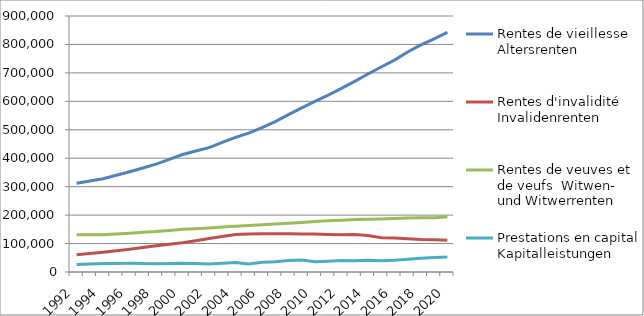
| Category | Rentes de vieillesse | Rentes d'invalidité | Rentes de veuves et de veufs | Prestations en capital |
|---|---|---|---|---|
| 1992.0 | 312325 | 60597 | 130710 | 26457 |
| 1993.0 | 320058.5 | 65179 | 130871 | 28070.5 |
| 1994.0 | 327792 | 69761 | 131032 | 29684 |
| 1995.0 | 340185.5 | 74892 | 133756 | 30013 |
| 1996.0 | 352579 | 80023 | 136480 | 30342 |
| 1997.0 | 365830 | 86134.5 | 139322 | 29743.5 |
| 1998.0 | 379081 | 92246 | 142164 | 29145 |
| 1999.0 | 396080.5 | 97375 | 146104 | 30154.5 |
| 2000.0 | 413080 | 102504 | 150044 | 31164 |
| 2001.0 | 425192 | 110169.5 | 152324 | 29736 |
| 2002.0 | 437304 | 117835 | 154604 | 28308 |
| 2003.0 | 455437 | 124769.5 | 157800.5 | 30957 |
| 2004.0 | 473570 | 131704 | 160997 | 33606 |
| 2005.0 | 488218 | 133371 | 163634 | 28143 |
| 2006.0 | 507256 | 134804 | 166104 | 33892 |
| 2007.0 | 528866 | 134620 | 168510 | 36394 |
| 2008.0 | 553378 | 134217 | 171383 | 40285 |
| 2009.0 | 577165 | 133895 | 174016 | 42156 |
| 2010.0 | 599856 | 133163 | 177311 | 36225 |
| 2011.0 | 621780 | 132139 | 179991 | 37918 |
| 2012.0 | 645702 | 131150 | 182339 | 40382 |
| 2013.0 | 670411 | 131708 | 184499 | 39664 |
| 2014.0 | 696176 | 128265 | 185096 | 41369 |
| 2015.0 | 720815 | 120706 | 186484 | 39719 |
| 2016.0 | 744977 | 119500 | 188012 | 41187 |
| 2017.0 | 773299 | 117286 | 189571 | 44476 |
| 2018.0 | 798554 | 114534 | 191046 | 48142 |
| 2019.0 | 819887 | 113029 | 190604 | 51028 |
| 2020.0 | 842357 | 111975 | 194113 | 52405 |